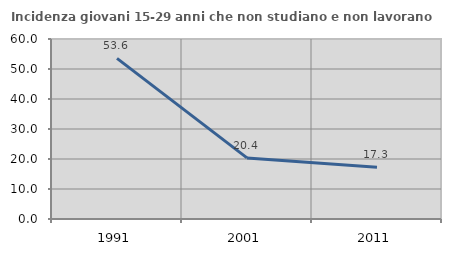
| Category | Incidenza giovani 15-29 anni che non studiano e non lavorano  |
|---|---|
| 1991.0 | 53.556 |
| 2001.0 | 20.364 |
| 2011.0 | 17.29 |